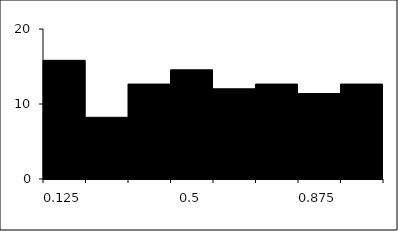
| Category | Series 1 |
|---|---|
| 0.125 | 15.823 |
| 0.25 | 8.228 |
| 0.375 | 12.658 |
| 0.5 | 14.557 |
| 0.625 | 12.025 |
| 0.75 | 12.658 |
| 0.875 | 11.392 |
| 1.0 | 12.658 |